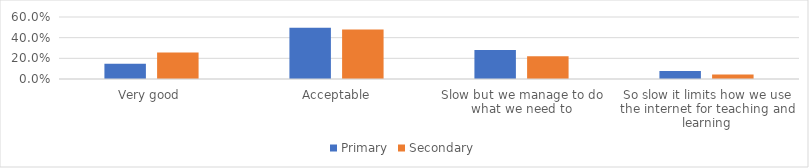
| Category | Primary | Secondary |
|---|---|---|
| Very good | 0.147 | 0.257 |
| Acceptable | 0.495 | 0.478 |
| Slow but we manage to do what we need to | 0.281 | 0.221 |
| So slow it limits how we use the internet for teaching and learning | 0.077 | 0.044 |